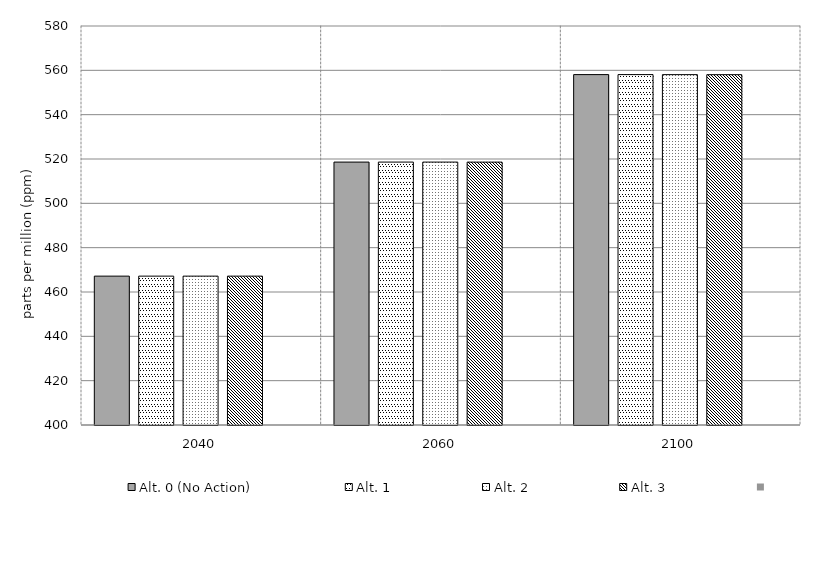
| Category | Alt. 0 (No Action) | Alt. 1 | Alt. 2 | Alt. 3 | Series 4 | Alt 5 | Alt 6 | Alt 7 | Alt 8 | Alt 10 |
|---|---|---|---|---|---|---|---|---|---|---|
| 2040.0 | 467.159 | 467.159 | 467.159 | 467.156 |  |  |  |  |  |  |
| 2060.0 | 518.609 | 518.609 | 518.605 | 518.593 |  |  |  |  |  |  |
| 2100.0 | 558.072 | 558.071 | 558.063 | 558.037 |  |  |  |  |  |  |